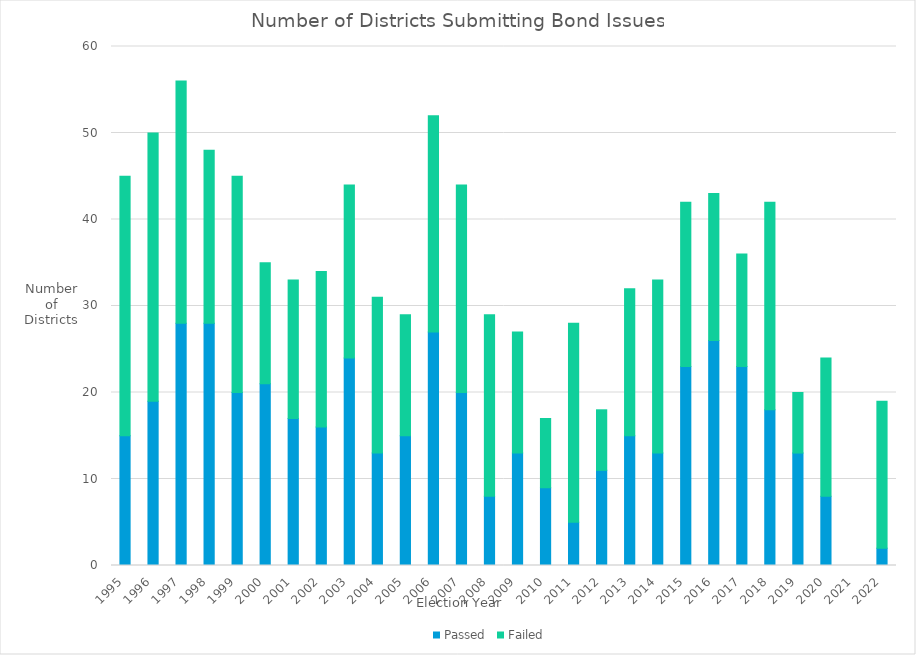
| Category | Passed | Failed |
|---|---|---|
| 1995 | 15 | 30 |
| 1996 | 19 | 31 |
| 1997 | 28 | 28 |
| 1998 | 28 | 20 |
| 1999 | 20 | 25 |
| 2000 | 21 | 14 |
| 2001 | 17 | 16 |
| 2002 | 16 | 18 |
| 2003 | 24 | 20 |
| 2004 | 13 | 18 |
| 2005 | 15 | 14 |
| 2006 | 27 | 25 |
| 2007 | 20 | 24 |
| 2008 | 8 | 21 |
| 2009 | 13 | 14 |
| 2010 | 9 | 8 |
| 2011 | 5 | 23 |
| 2012 | 11 | 7 |
| 2013 | 15 | 17 |
| 2014 | 13 | 20 |
| 2015 | 23 | 19 |
| 2016 | 26 | 17 |
| 2017 | 23 | 13 |
| 2018 | 18 | 24 |
| 2019 | 13 | 7 |
| 2020 | 8 | 16 |
| 2021 | 0 | 0 |
| 2022 | 2 | 17 |